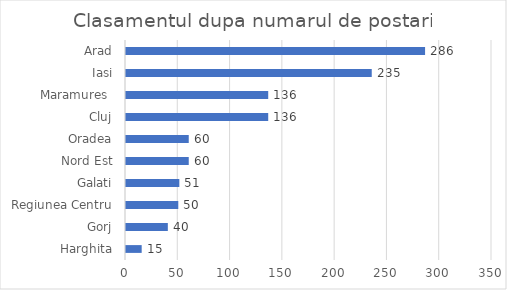
| Category | Series 0 |
|---|---|
| Harghita | 15 |
| Gorj | 40 |
| Regiunea Centru | 50 |
| Galati | 51 |
| Nord Est | 60 |
| Oradea | 60 |
| Cluj | 136 |
| Maramures  | 136 |
| Iasi | 235 |
| Arad | 286 |